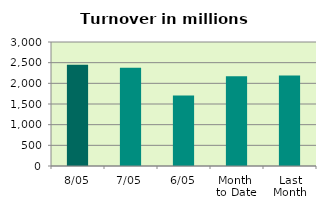
| Category | Series 0 |
|---|---|
| 8/05 | 2446.843 |
| 7/05 | 2378.996 |
| 6/05 | 1704.898 |
| Month 
to Date | 2168.869 |
| Last
Month | 2186.926 |